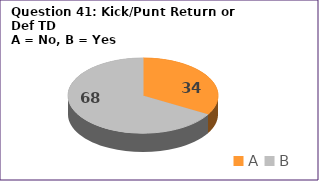
| Category | Series 0 |
|---|---|
| A | 34 |
| B | 68 |